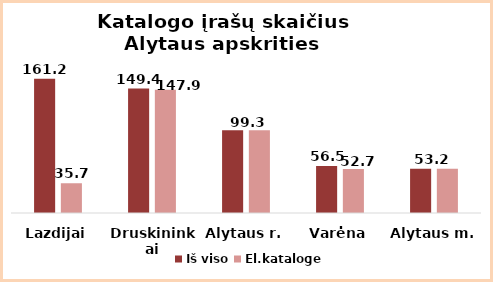
| Category | Iš viso | El.kataloge |
|---|---|---|
| Lazdijai | 161.2 | 35.7 |
| Druskininkai | 149.4 | 147.9 |
| Alytaus r. | 99.3 | 99.3 |
| Varėna | 56.5 | 52.7 |
| Alytaus m. | 53.2 | 53.2 |